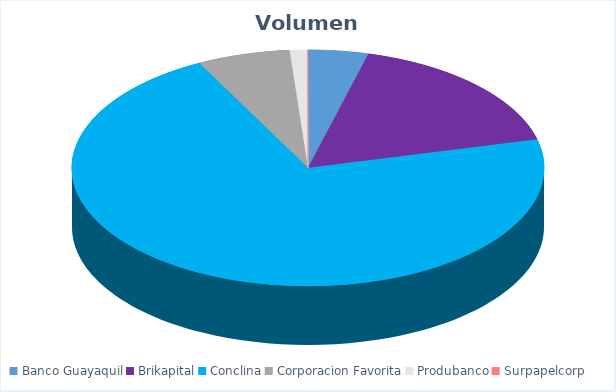
| Category | VOLUMEN ($USD) |
|---|---|
| Banco Guayaquil | 47876.96 |
| Brikapital | 198000 |
| Conclina | 830516 |
| Corporacion Favorita | 74088.35 |
| Produbanco | 14000 |
| Surpapelcorp | 488.75 |